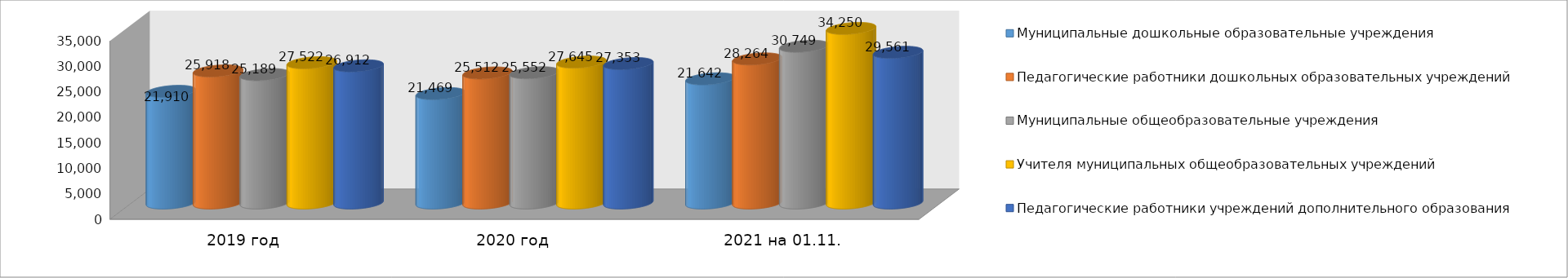
| Category | Муниципальные дошкольные образовательные учреждения | Педагогические работники дошкольных образовательных учреждений | Муниципальные общеобразовательные учреждения | Учителя муниципальных общеобразовательных учреждений | Педагогические работники учреждений дополнительного образования |
|---|---|---|---|---|---|
| 2019 год | 21910 | 25918 | 25189 | 27522 | 26912 |
| 2020 год | 21469 | 25512 | 25552 | 27645 | 27353 |
| 2021 на 01.11. | 24364 | 28264 | 30749 | 34250 | 29561 |